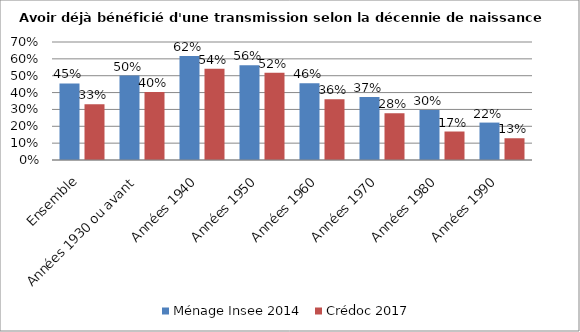
| Category | Ménage Insee 2014 | Crédoc 2017 |
|---|---|---|
| Ensemble | 0.454 | 0.331 |
| Années 1930 ou avant | 0.501 | 0.403 |
| Années 1940 | 0.617 | 0.542 |
| Années 1950 | 0.562 | 0.517 |
| Années 1960 | 0.455 | 0.36 |
| Années 1970 | 0.373 | 0.278 |
| Années 1980 | 0.296 | 0.169 |
| Années 1990 | 0.222 | 0.129 |